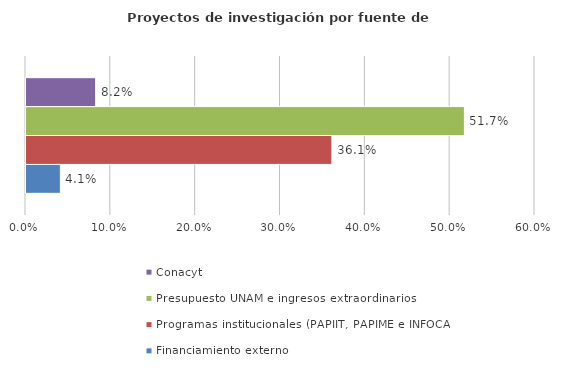
| Category | Financiamiento externo | Programas institucionales (PAPIIT, PAPIME e INFOCAB) | Presupuesto UNAM e ingresos extraordinarios | Conacyt |
|---|---|---|---|---|
| 0 | 0.041 | 0.361 | 0.517 | 0.082 |